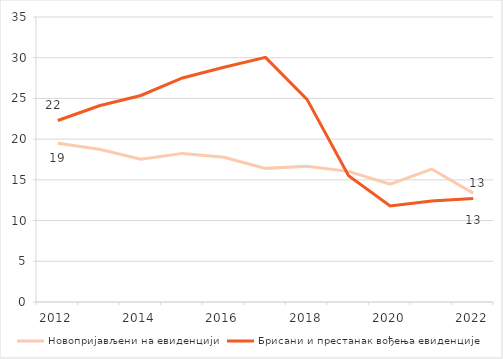
| Category | Новопријављени на евиденцији | Брисани и престанак вођења евиденције |
|---|---|---|
| 2012.0 | 19.49 | 22.291 |
| 2013.0 | 18.755 | 24.097 |
| 2014.0 | 17.538 | 25.36 |
| 2015.0 | 18.251 | 27.516 |
| 2016.0 | 17.78 | 28.832 |
| 2017.0 | 16.411 | 30.047 |
| 2018.0 | 16.682 | 24.89 |
| 2019.0 | 16.045 | 15.506 |
| 2020.0 | 14.457 | 11.787 |
| 2021.0 | 16.328 | 12.403 |
| 2022.0 | 13.374 | 12.715 |